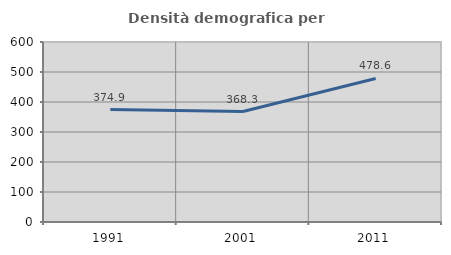
| Category | Densità demografica |
|---|---|
| 1991.0 | 374.861 |
| 2001.0 | 368.294 |
| 2011.0 | 478.573 |